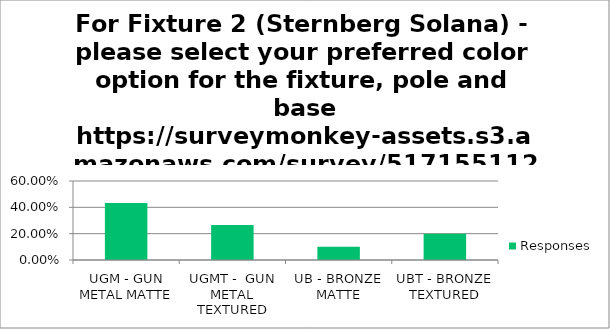
| Category | Responses |
|---|---|
| UGM - GUN METAL MATTE | 0.433 |
| UGMT -  GUN METAL TEXTURED | 0.267 |
| UB - BRONZE MATTE | 0.1 |
| UBT - BRONZE TEXTURED | 0.2 |